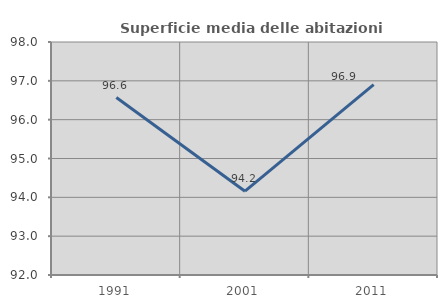
| Category | Superficie media delle abitazioni occupate |
|---|---|
| 1991.0 | 96.57 |
| 2001.0 | 94.158 |
| 2011.0 | 96.9 |